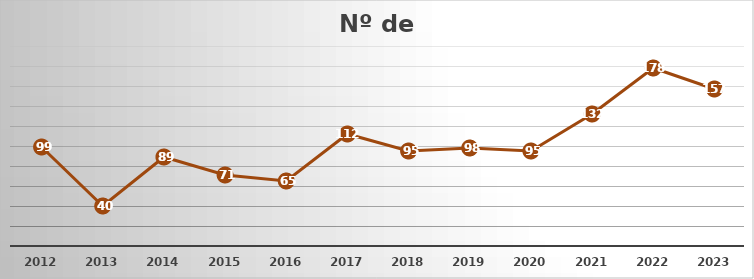
| Category | Total xeral |
|---|---|
| 2012 | 99 |
| 2013 | 40 |
| 2014 | 89 |
| 2015 | 71 |
| 2016 | 65 |
| 2017 | 112 |
| 2018 | 95 |
| 2019 | 98 |
| 2020 | 95 |
| 2021 | 132 |
| 2022 | 178 |
| 2023 | 157 |